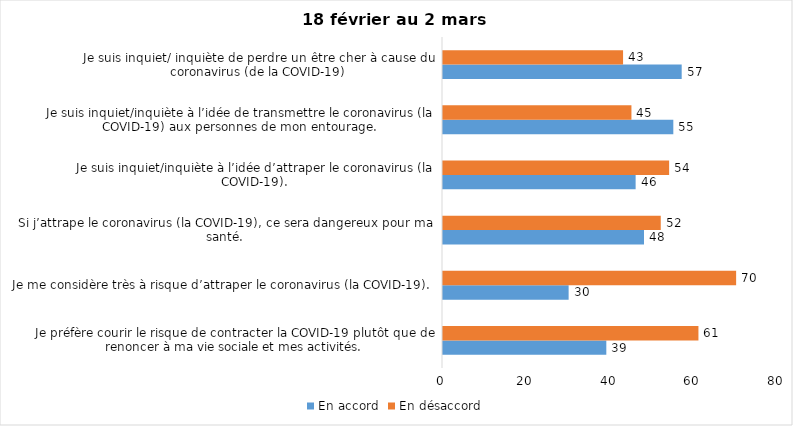
| Category | En accord | En désaccord |
|---|---|---|
| Je préfère courir le risque de contracter la COVID-19 plutôt que de renoncer à ma vie sociale et mes activités. | 39 | 61 |
| Je me considère très à risque d’attraper le coronavirus (la COVID-19). | 30 | 70 |
| Si j’attrape le coronavirus (la COVID-19), ce sera dangereux pour ma santé. | 48 | 52 |
| Je suis inquiet/inquiète à l’idée d’attraper le coronavirus (la COVID-19). | 46 | 54 |
| Je suis inquiet/inquiète à l’idée de transmettre le coronavirus (la COVID-19) aux personnes de mon entourage. | 55 | 45 |
| Je suis inquiet/ inquiète de perdre un être cher à cause du coronavirus (de la COVID-19) | 57 | 43 |